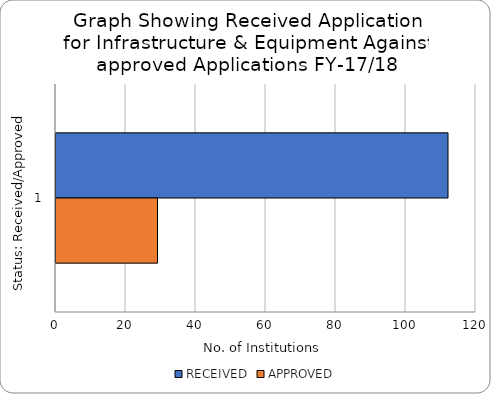
| Category | RECEIVED | APPROVED |
|---|---|---|
| 0 | 112 | 29 |